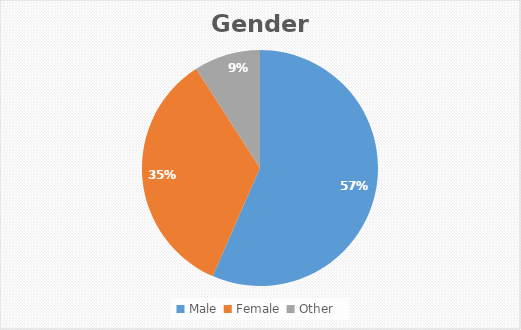
| Category | Series 0 |
|---|---|
| Male  | 0.566 |
| Female  | 0.343 |
| Other  | 0.091 |